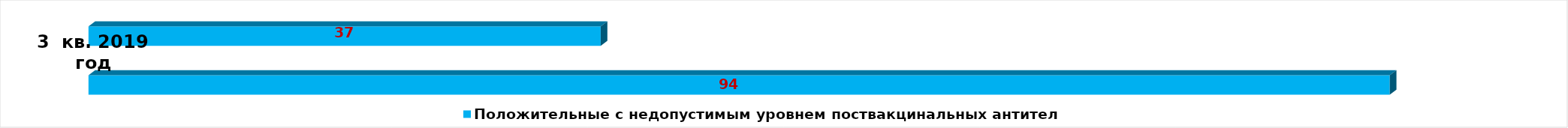
| Category | Положительные с недопустимым уровнем поствакцинальных антител |
|---|---|
| Положительные с недопустимым уровнем поствакцинальных антител | 94 |